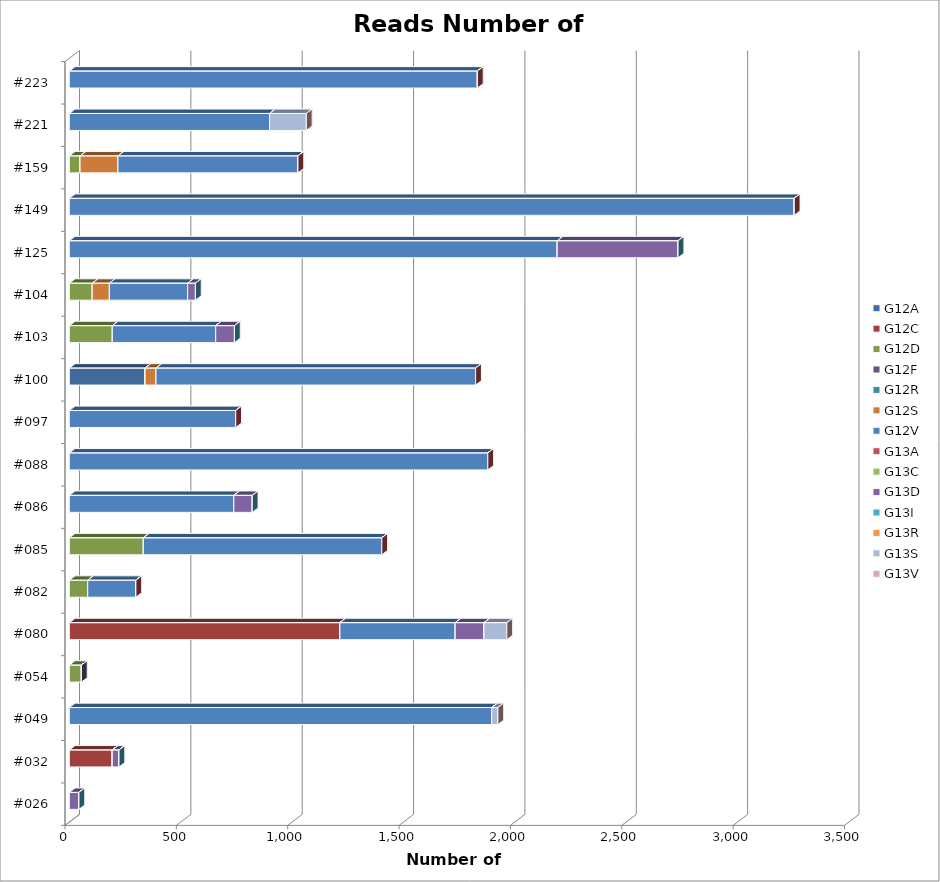
| Category | G12A | G12C | G12D | G12F | G12R | G12S | G12V | G13A | G13C | G13D | G13I | G13R | G13S | G13V |
|---|---|---|---|---|---|---|---|---|---|---|---|---|---|---|
| #026 | 0 | 0 | 0 | 0 | 0 | 0 | 0 | 0 | 0 | 43.108 | 0 | 0 | 0 | 0 |
| #032 | 0 | 192.845 | 0 | 0 | 0 | 0 | 0 | 0 | 0 | 30.157 | 0 | 0 | 0 | 0 |
| #049 | 0 | 0 | 0 | 0 | 0 | 0 | 1896.816 | 0 | 0 | 0 | 0 | 0 | 27.373 | 0 |
| #054 | 0 | 0 | 54.227 | 0 | 0 | 0 | 0 | 0 | 0 | 0 | 0 | 0 | 0 | 0 |
| #080 | 0 | 1214.815 | 0 | 0 | 0 | 0 | 517.79 | 0 | 0 | 129.049 | 0 | 0 | 102.761 | 0 |
| #082 | 0 | 0 | 82.593 | 0 | 0 | 0 | 216.199 | 0 | 0 | 0 | 0 | 0 | 0 | 0 |
| #085 | 0 | 0 | 332.346 | 0 | 0 | 0 | 1070.629 | 0 | 0 | 0 | 0 | 0 | 0 | 0 |
| #086 | 0 | 0 | 0 | 0 | 0 | 0 | 738.623 | 0 | 0 | 82.829 | 0 | 0 | 0 | 0 |
| #088 | 0 | 0 | 0 | 0 | 0 | 0 | 1878.975 | 0 | 0 | 0 | 0 | 0 | 0 | 0 |
| #097 | 0 | 0 | 0 | 0 | 0 | 0 | 747.037 | 0 | 0 | 0 | 0 | 0 | 0 | 0 |
| #100 | 340.262 | 0 | 0 | 0 | 0 | 48.92 | 1434.972 | 0 | 0 | 0 | 0 | 0 | 0 | 0 |
| #103 | 0 | 0 | 193.124 | 0 | 0 | 0 | 464.12 | 0 | 0 | 84.102 | 0 | 0 | 0 | 0 |
| #104 | 0 | 0 | 102.947 | 0 | 0 | 76.725 | 351.574 | 0 | 0 | 34.963 | 0 | 0 | 0 | 0 |
| #125 | 0 | 0 | 0 | 0 | 0 | 0 | 2190.521 | 0 | 0 | 542.734 | 0 | 0 | 0 | 0 |
| #149 | 0 | 0 | 0 | 0 | 0 | 0 | 3254.928 | 0 | 0 | 0 | 0 | 0 | 0 | 0 |
| #159 | 0 | 0 | 48.248 | 0 | 0 | 170.074 | 808.154 | 0 | 0 | 0 | 0 | 0 | 0 | 0 |
| #221 | 0 | 0 | 0 | 0 | 0 | 0 | 898.868 | 0 | 0 | 0 | 0 | 0 | 165.263 | 0 |
| #223 | 0 | 0 | 0 | 0 | 0 | 0 | 1832.188 | 0 | 0 | 0 | 0 | 0 | 0 | 0 |